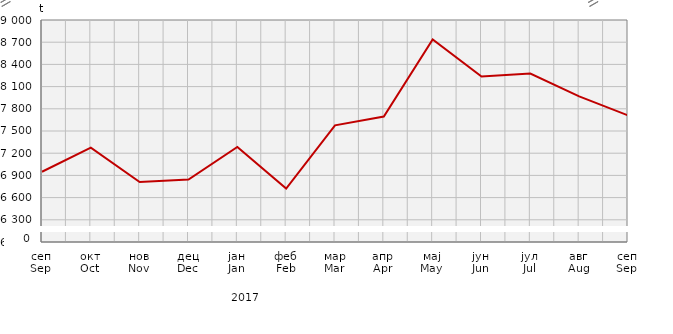
| Category | Прикупљање крављег млијека
Collecting of cow’s milk |
|---|---|
| сеп
Sep | 6949.6 |
| окт
Oct | 7275 |
| нов
Nov | 6810.8 |
| дец
Dec | 6844 |
| јан
Jan | 7283.5 |
| феб
Feb | 6721.8 |
| мар
Mar | 7575.8 |
| апр
Apr | 7695.5 |
| мај
May | 8737.947 |
| јун
Jun | 8235.2 |
| јул
Jul | 8277.3 |
| авг
Aug | 7968.1 |
| сеп
Sep | 7710.9 |